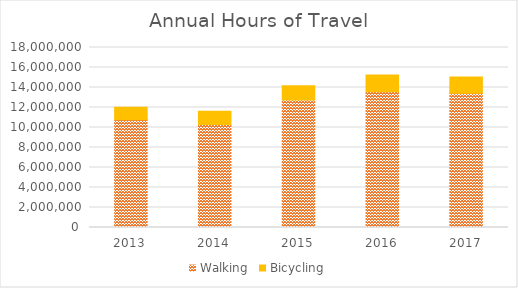
| Category | Walking | Bicycling |
|---|---|---|
| 2013 | 10769984.229 | 1261023.61 |
| 2014 | 10290954.7 | 1331970.267 |
| 2015 | 12740175.709 | 1432118.53 |
| 2016 | 13582402.535 | 1660939.094 |
| 2017 | 13413102.481 | 1632860.918 |